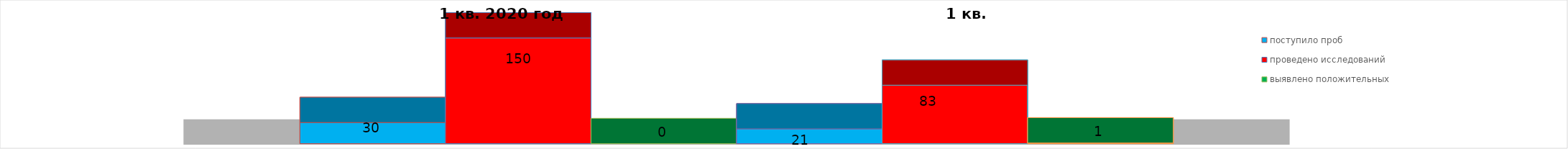
| Category | поступило проб | проведено исследований | выявлено положительных | 1 квартал 2021 год | 2016 год |
|---|---|---|---|---|---|
| 0 | 30 | 150 | 0 | 1 | 83 |